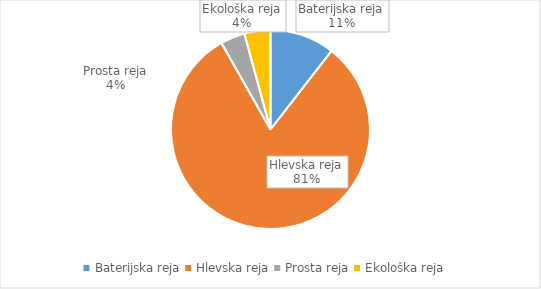
| Category | Količina kosov jajc |
|---|---|
| Baterijska reja | 259667 |
| Hlevska reja | 2009254 |
| Prosta reja | 98141 |
| Ekološka reja | 104836 |